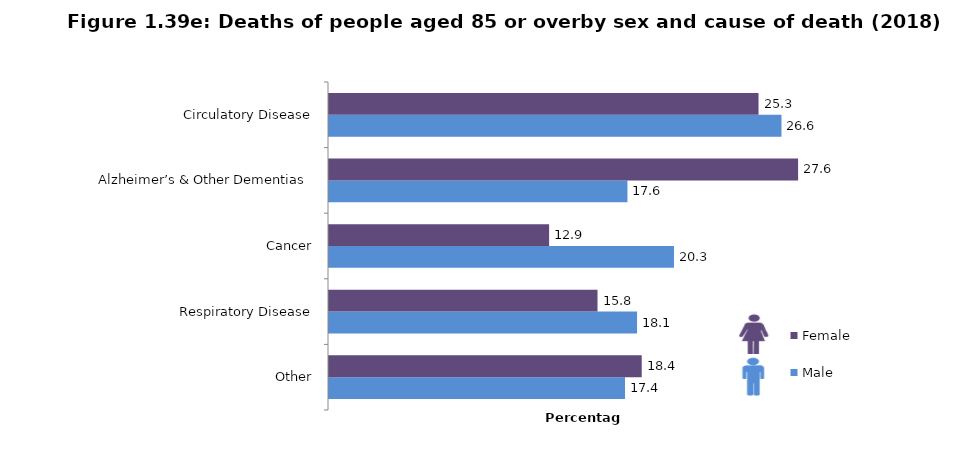
| Category | Male | Female |
|---|---|---|
| Other | 17.414 | 18.396 |
| Respiratory Disease | 18.122 | 15.795 |
| Cancer | 20.293 | 12.948 |
| Alzheimer’s & Other Dementias  | 17.555 | 27.594 |
| Circulatory Disease | 26.616 | 25.267 |